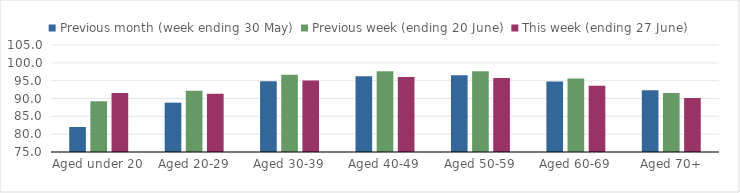
| Category | Previous month (week ending 30 May) | Previous week (ending 20 June) | This week (ending 27 June) |
|---|---|---|---|
| Aged under 20 | 82.007 | 89.225 | 91.531 |
| Aged 20-29 | 88.837 | 92.151 | 91.312 |
| Aged 30-39 | 94.835 | 96.673 | 95.016 |
| Aged 40-49 | 96.207 | 97.643 | 96.051 |
| Aged 50-59 | 96.504 | 97.612 | 95.766 |
| Aged 60-69 | 94.744 | 95.621 | 93.589 |
| Aged 70+ | 92.286 | 91.533 | 90.115 |